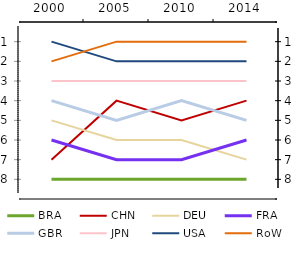
| Category | BRA | CHN | DEU | FRA | GBR | JPN | USA |
|---|---|---|---|---|---|---|---|
| 2000.0 | 8 | 7 | 5 | 6 | 4 | 3 | 1 |
| 2005.0 | 8 | 4 | 6 | 7 | 5 | 3 | 2 |
| 2010.0 | 8 | 5 | 6 | 7 | 4 | 3 | 2 |
| 2014.0 | 8 | 4 | 7 | 6 | 5 | 3 | 2 |